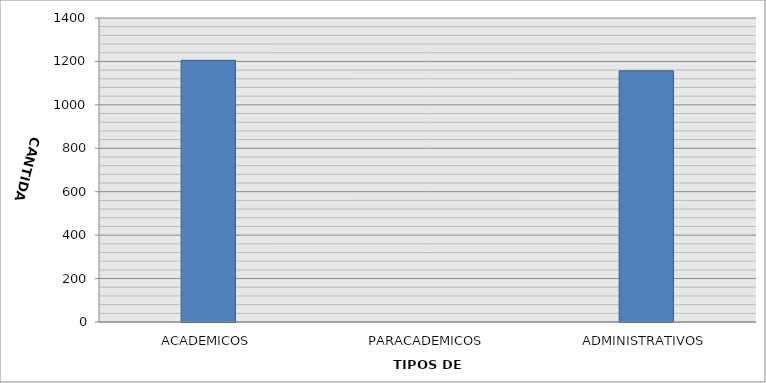
| Category | CANTIDAD |
|---|---|
| ACADEMICOS | 1205 |
| PARACADEMICOS | 0 |
| ADMINISTRATIVOS | 1157 |